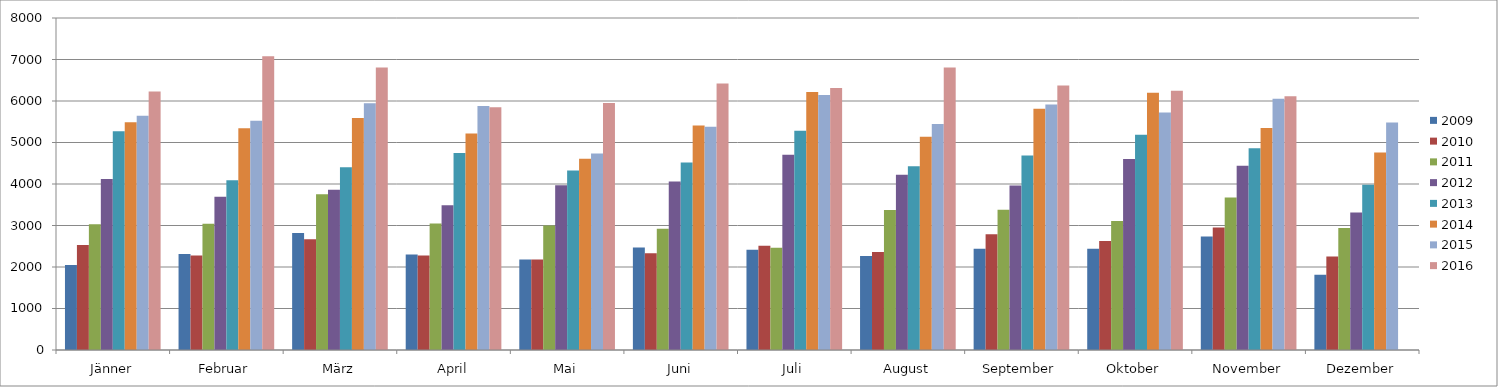
| Category | 2009 | 2010 | 2011 | 2012 | 2013 | 2014 | 2015 | 2016 |
|---|---|---|---|---|---|---|---|---|
| Jänner | 2047 | 2530 | 3032 | 4120 | 5271 | 5485 | 5643 | 6230 |
| Februar | 2313 | 2278 | 3045 | 3694 | 4090 | 5346 | 5526 | 7077 |
| März | 2819 | 2669 | 3754 | 3860 | 4402 | 5592 | 5947 | 6805 |
| April | 2301 | 2277 | 3049 | 3489 | 4750 | 5215 | 5878 | 5852 |
| Mai | 2181 | 2183 | 2998 | 3967 | 4323 | 4606 | 4735 | 5949 |
| Juni | 2470 | 2330 | 2920 | 4061 | 4516 | 5410 | 5377 | 6423 |
| Juli | 2414 | 2510 | 2463 | 4703 | 5281 | 6216 | 6147 | 6313 |
| August | 2267 | 2362 | 3371 | 4224 | 4430 | 5137 | 5443 | 6805 |
| September | 2437 | 2789 | 3378 | 3961 | 4684 | 5811 | 5915 | 6372 |
| Oktober | 2438 | 2625 | 3106 | 4603 | 5189 | 6197 | 5725 | 6245 |
| November | 2737 | 2953 | 3675 | 4442 | 4863 | 5347 | 6052 | 6114 |
| Dezember | 1813 | 2252 | 2942 | 3313 | 3984 | 4758 | 5482 | 0 |